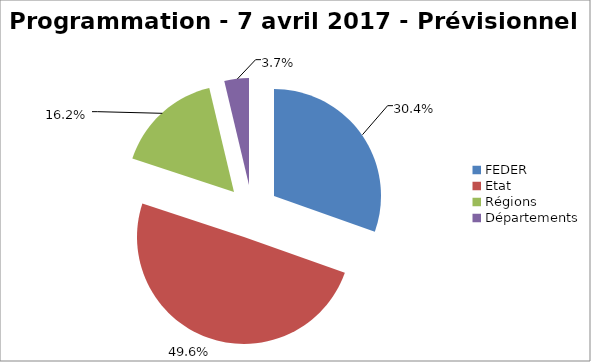
| Category | Series 0 |
|---|---|
| FEDER | 725766 |
| Etat | 1183578.2 |
| Régions | 386923.77 |
| Départements | 88560 |